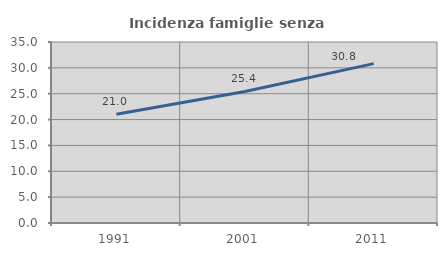
| Category | Incidenza famiglie senza nuclei |
|---|---|
| 1991.0 | 21.023 |
| 2001.0 | 25.435 |
| 2011.0 | 30.82 |